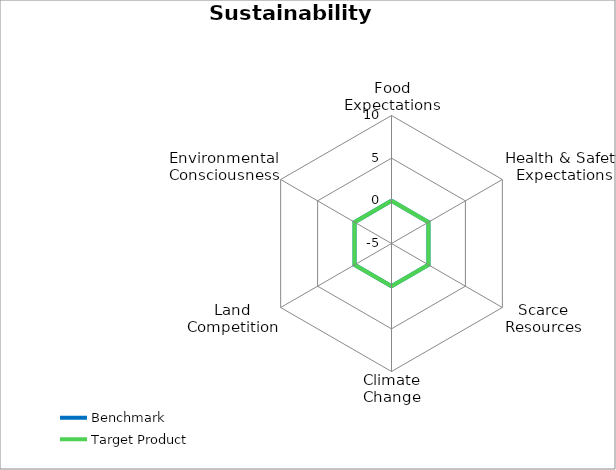
| Category | Benchmark | Target Product |
|---|---|---|
| Food Expectations | 0 | 0 |
| Health & Safety Expectations | 0 | 0 |
| Scarce Resources | 0 | 0 |
| Climate Change | 0 | 0 |
| Land Competition | 0 | 0 |
| Environmental Consciousness | 0 | 0 |